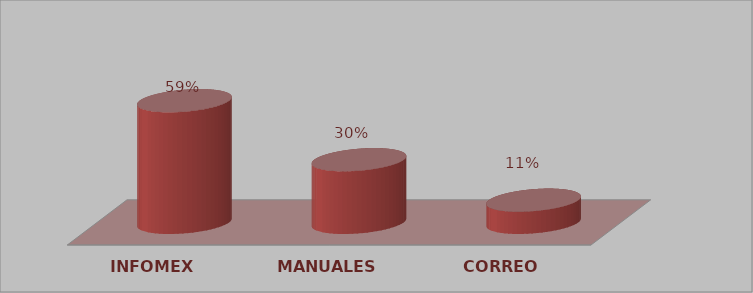
| Category | Series 0 | Series 1 |
|---|---|---|
| INFOMEX | 328 | 0.589 |
| MANUALES | 169 | 0.303 |
| CORREO | 60 | 0.108 |